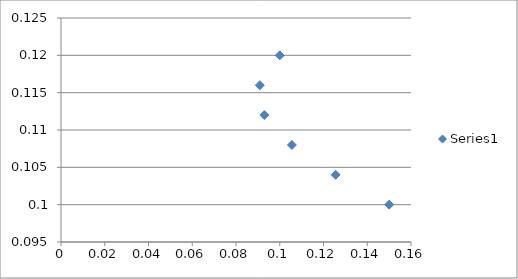
| Category | Series 0 |
|---|---|
| 0.1 | 0.12 |
| 0.09088454214001412 | 0.116 |
| 0.09295160030897802 | 0.112 |
| 0.10554619841567009 | 0.108 |
| 0.12553883861180173 | 0.104 |
| 0.15 | 0.1 |